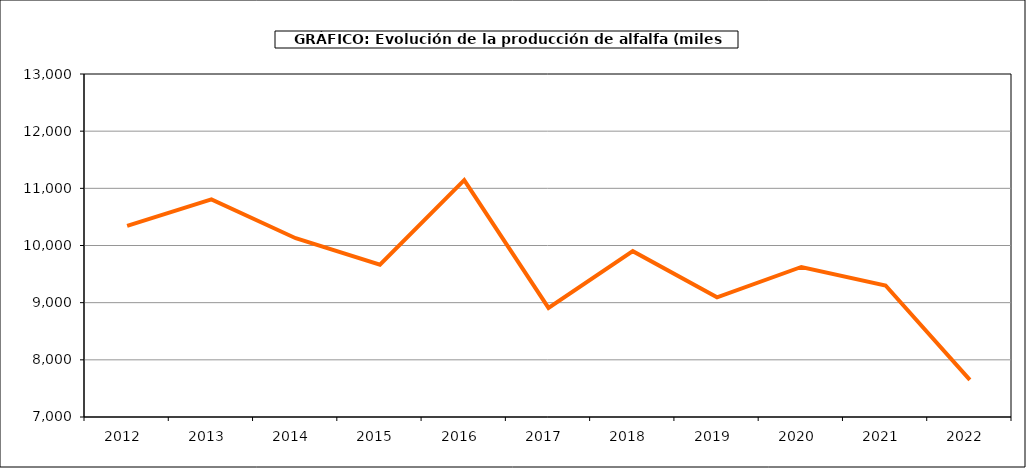
| Category | Producción |
|---|---|
| 2012.0 | 10342.799 |
| 2013.0 | 10806.54 |
| 2014.0 | 10126.971 |
| 2015.0 | 9664.728 |
| 2016.0 | 11143.962 |
| 2017.0 | 8908.163 |
| 2018.0 | 9900.827 |
| 2019.0 | 9093.858 |
| 2020.0 | 9624.211 |
| 2021.0 | 9299.827 |
| 2022.0 | 7649.051 |